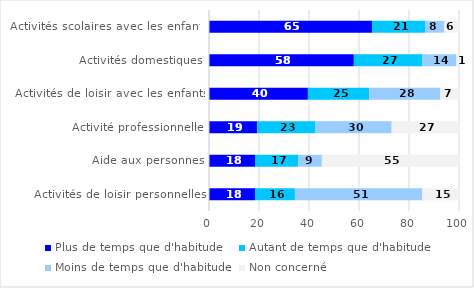
| Category | Plus de temps que d'habitude | Autant de temps que d'habitude | Moins de temps que d'habitude | Non concerné |
|---|---|---|---|---|
| Activités scolaires avec les enfants | 65.19 | 21.25 | 7.69 | 5.87 |
| Activités domestiques | 57.94 | 27.42 | 13.63 | 1.01 |
| Activités de loisir avec les enfants | 39.56 | 24.53 | 28.45 | 7.45 |
| Activité professionnelle | 19.24 | 23.38 | 30.44 | 26.94 |
| Aide aux personnes | 18.4 | 17.36 | 9.39 | 54.85 |
| Activités de loisir personnelles | 18.39 | 15.99 | 51.01 | 14.61 |